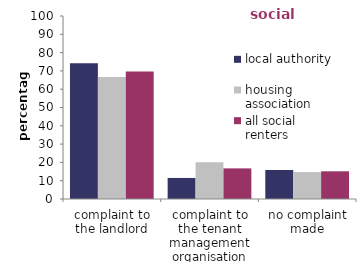
| Category | local authority | housing association | all social renters |
|---|---|---|---|
| complaint to the landlord | 74.241 | 66.67 | 69.605 |
| complaint to the tenant management organisation | 11.497 | 20.048 | 16.734 |
| no complaint made | 15.841 | 14.698 | 15.141 |